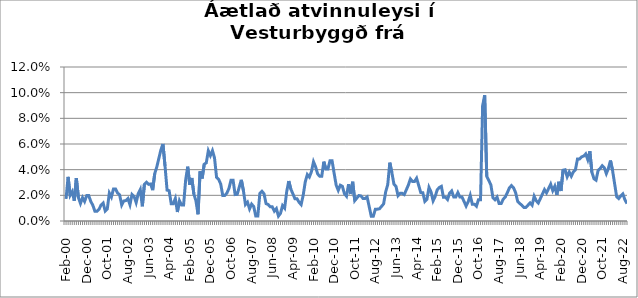
| Category | Series 0 |
|---|---|
| Feb-00 | 0.017 |
| Mar-00 | 0.034 |
| Apr-00 | 0.02 |
| May-00 | 0.023 |
| Jun-00 | 0.016 |
| Jul-00 | 0.033 |
| Aug-00 | 0.018 |
| Sep-00 | 0.014 |
| Oct-00 | 0.018 |
| Nov-00 | 0.015 |
| Dec-00 | 0.02 |
| Jan-01 | 0.02 |
| Feb-01 | 0.015 |
| Mar-01 | 0.012 |
| Apr-01 | 0.008 |
| May-01 | 0.008 |
| Jun-01 | 0.009 |
| Jul-01 | 0.012 |
| Aug-01 | 0.014 |
| Sep-01 | 0.008 |
| Oct-01 | 0.009 |
| Nov-01 | 0.022 |
| Dec-01 | 0.019 |
| Jan-02 | 0.025 |
| Feb-02 | 0.025 |
| Mar-02 | 0.022 |
| Apr-02 | 0.02 |
| May-02 | 0.012 |
| Jun-02 | 0.016 |
| Jul-02 | 0.016 |
| Aug-02 | 0.017 |
| Sep-02 | 0.013 |
| Oct-02 | 0.021 |
| Nov-02 | 0.019 |
| Dec-02 | 0.014 |
| Jan-03 | 0.021 |
| Feb-03 | 0.025 |
| Mar-03 | 0.011 |
| Apr-03 | 0.029 |
| May-03 | 0.03 |
| Jun-03 | 0.029 |
| Jul-03 | 0.029 |
| Aug-03 | 0.024 |
| Sep-03 | 0.037 |
| Oct-03 | 0.042 |
| Nov-03 | 0.049 |
| Dec-03 | 0.055 |
| Jan-04 | 0.06 |
| Feb-04 | 0.043 |
| Mar-04 | 0.024 |
| Apr-04 | 0.024 |
| May-04 | 0.013 |
| Jun-04 | 0.013 |
| Jul-04 | 0.018 |
| Aug-04 | 0.007 |
| Sep-04 | 0.016 |
| Oct-04 | 0.012 |
| Nov-04 | 0.012 |
| Dec-04 | 0.032 |
| Jan-05 | 0.042 |
| Feb-05 | 0.028 |
| Mar-05 | 0.034 |
| Apr-05 | 0.021 |
| May-05 | 0.016 |
| Jun-05 | 0.005 |
| Jul-05 | 0.039 |
| Aug-05 | 0.033 |
| Sep-05 | 0.044 |
| Oct-05 | 0.045 |
| Nov-05 | 0.055 |
| Dec-05 | 0.051 |
| Jan-06 | 0.055 |
| Feb-06 | 0.049 |
| Mar-06 | 0.034 |
| Apr-06 | 0.032 |
| May-06 | 0.029 |
| Jun-06 | 0.02 |
| Jul-06 | 0.02 |
| Aug-06 | 0.022 |
| Sep-06 | 0.025 |
| Oct-06 | 0.032 |
| Nov-06 | 0.032 |
| Dec-06 | 0.021 |
| Jan-07 | 0.021 |
| Feb-07 | 0.026 |
| Mar-07 | 0.032 |
| Apr-07 | 0.024 |
| May-07 | 0.013 |
| Jun-07 | 0.015 |
| Jul-07 | 0.009 |
| Aug-07 | 0.013 |
| Sep-07 | 0.011 |
| Oct-07 | 0.004 |
| Nov-07 | 0.004 |
| Dec-07 | 0.022 |
| Jan-08 | 0.023 |
| Feb-08 | 0.021 |
| Mar-08 | 0.014 |
| Apr-08 | 0.013 |
| May-08 | 0.011 |
| Jun-08 | 0.011 |
| Jul-08 | 0.008 |
| Aug-08 | 0.01 |
| Sep-08 | 0.004 |
| Oct-08 | 0.006 |
| Nov-08 | 0.012 |
| Dec-08 | 0.01 |
| Jan-09 | 0.023 |
| Feb-09 | 0.031 |
| Mar-09 | 0.025 |
| Apr-09 | 0.021 |
| May-09 | 0.017 |
| Jun-09 | 0.017 |
| Jul-09 | 0.015 |
| Aug-09 | 0.013 |
| Sep-09 | 0.02 |
| Oct-09 | 0.03 |
| Nov-09 | 0.036 |
| Dec-09 | 0.034 |
| Jan-10 | 0.038 |
| Feb-10 | 0.046 |
| Mar-10 | 0.042 |
| Apr-10 | 0.037 |
| May-10 | 0.035 |
| Jun-10 | 0.035 |
| Jul-10 | 0.046 |
| Aug-10 | 0.04 |
| Sep-10 | 0.04 |
| Oct-10 | 0.047 |
| Nov-10 | 0.047 |
| Dec-10 | 0.037 |
| Jan-11 | 0.028 |
| Feb-11 | 0.024 |
| Mar-11 | 0.028 |
| Apr-11 | 0.027 |
| May-11 | 0.021 |
| Jun-11 | 0.019 |
| Jul-11 | 0.029 |
| Aug-11 | 0.021 |
| Sep-11 | 0.031 |
| Oct-11 | 0.016 |
| Nov-11 | 0.018 |
| Dec-11 | 0.02 |
| Jan-12 | 0.02 |
| Feb-12 | 0.018 |
| Mar-12 | 0.018 |
| Apr-12 | 0.019 |
| May-12 | 0.011 |
| Jun-12 | 0.004 |
| Jul-12 | 0.004 |
| Aug-12 | 0.009 |
| Sep-12 | 0.009 |
| Oct-12 | 0.01 |
| Nov-12 | 0.011 |
| Dec-12 | 0.013 |
| Jan-13 | 0.023 |
| Feb-13 | 0.028 |
| Mar-13 | 0.045 |
| Apr-13 | 0.038 |
| May-13 | 0.029 |
| Jun-13 | 0.027 |
| Jul-13 | 0.02 |
| Aug-13 | 0.022 |
| Sep-13 | 0.022 |
| Oct-13 | 0.021 |
| Nov-13 | 0.024 |
| Dec-13 | 0.028 |
| jan..14 | 0.033 |
| Feb-14 | 0.031 |
| Mar-14 | 0.031 |
| Apr-14 | 0.033 |
| May-14 | 0.028 |
| Jun-14 | 0.022 |
| Jul-14 | 0.022 |
| Aug-14 | 0.015 |
| Sep-14 | 0.017 |
| Oct-14 | 0.026 |
| Nov-14 | 0.023 |
| Dec-14 | 0.016 |
| Jan-15 | 0.019 |
| Feb-15 | 0.024 |
| Mar-15 | 0.026 |
| Apr-15 | 0.027 |
| May-15 | 0.019 |
| Jun-15 | 0.019 |
| Jul-15 | 0.017 |
| Aug-15 | 0.022 |
| Sep-15 | 0.023 |
| Oct-15 | 0.019 |
| Nov-15 | 0.019 |
| Dec-15 | 0.022 |
| Jan-16 | 0.019 |
| Feb-16 | 0.019 |
| Mar-16 | 0.015 |
| Apr-16 | 0.012 |
| May-16 | 0.015 |
| Jun-16 | 0.02 |
| Jul-16 | 0.013 |
| Aug-16 | 0.013 |
| Sep-16 | 0.011 |
| Oct-16 | 0.017 |
| Nov-16 | 0.017 |
| Dec-16 | 0.09 |
| Jan-17 | 0.098 |
| Feb-17 | 0.035 |
| Mar-17 | 0.032 |
| Apr-17 | 0.028 |
| May-17 | 0.018 |
| Jun-17 | 0.017 |
| Jul-17 | 0.019 |
| Aug-17 | 0.014 |
| Sep-17 | 0.014 |
| Oct-17 | 0.017 |
| Nov-17 | 0.019 |
| Dec-17 | 0.022 |
| Jan-18 | 0.026 |
| Feb-18 | 0.028 |
| Mar-18 | 0.026 |
| Apr-18 | 0.022 |
| May-18 | 0.015 |
| Jun-18 | 0.014 |
| Jul-18 | 0.012 |
| Aug-18 | 0.011 |
| Sep-18 | 0.011 |
| Oct-18 | 0.012 |
| Nov-18 | 0.014 |
| Dec-18 | 0.012 |
| Jan-19 | 0.019 |
| Feb-19 | 0.016 |
| Mar-19 | 0.014 |
| Apr-19 | 0.017 |
| May-19 | 0.021 |
| Jun-19 | 0.024 |
| Jul-19 | 0.022 |
| Aug-19 | 0.025 |
| Sep-19 | 0.029 |
| Oct-19 | 0.024 |
| Nov-19 | 0.027 |
| Dec-19 | 0.02 |
| Jan-20 | 0.031 |
| Feb-20 | 0.023 |
| Mar-20 | 0.04 |
| Apr-20 | 0.04 |
| May-20 | 0.034 |
| Jun-20 | 0.038 |
| Jul-20 | 0.035 |
| Aug-20 | 0.038 |
| Sep-20 | 0.04 |
| Oct-20 | 0.048 |
| Nov-20 | 0.048 |
| Dec-20 | 0.05 |
| Jan-21 | 0.051 |
| Feb-21 | 0.052 |
| Mar-21 | 0.048 |
| Apr-21 | 0.054 |
| May-21 | 0.038 |
| Jun-21 | 0.033 |
| Jul-21 | 0.032 |
| Aug-21 | 0.039 |
| Sep-21 | 0.041 |
| Oct-21 | 0.043 |
| Nov-21 | 0.042 |
| Dec-21 | 0.037 |
| Jan-22 | 0.041 |
| Feb-22 | 0.047 |
| Mar-22 | 0.04 |
| Apr-22 | 0.029 |
| May-22 | 0.019 |
| Jun-22 | 0.017 |
| Jul-22 | 0.02 |
| Aug-22 | 0.021 |
| Sep-22 | 0.017 |
| Oct-22 | 0.014 |